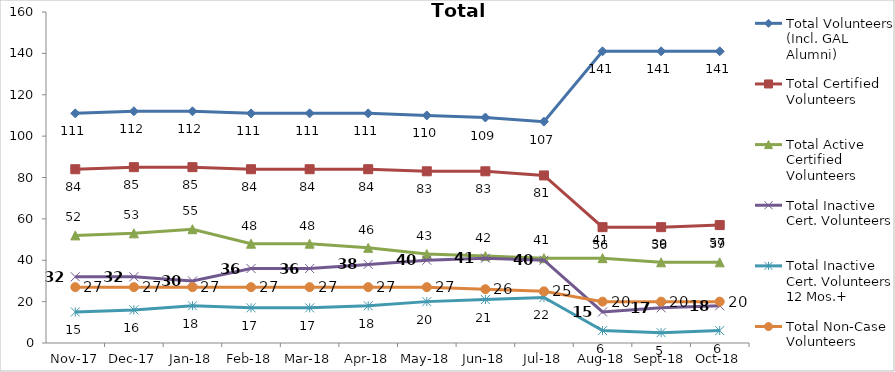
| Category | Total Volunteers (Incl. GAL Alumni) | Total Certified Volunteers | Total Active Certified Volunteers | Total Inactive Cert. Volunteers | Total Inactive Cert. Volunteers 12 Mos.+ | Total Non-Case Volunteers |
|---|---|---|---|---|---|---|
| 2017-11-01 | 111 | 84 | 52 | 32 | 15 | 27 |
| 2017-12-01 | 112 | 85 | 53 | 32 | 16 | 27 |
| 2018-01-01 | 112 | 85 | 55 | 30 | 18 | 27 |
| 2018-02-01 | 111 | 84 | 48 | 36 | 17 | 27 |
| 2018-03-01 | 111 | 84 | 48 | 36 | 17 | 27 |
| 2018-04-01 | 111 | 84 | 46 | 38 | 18 | 27 |
| 2018-05-01 | 110 | 83 | 43 | 40 | 20 | 27 |
| 2018-06-01 | 109 | 83 | 42 | 41 | 21 | 26 |
| 2018-07-01 | 107 | 81 | 41 | 40 | 22 | 25 |
| 2018-08-01 | 141 | 56 | 41 | 15 | 6 | 20 |
| 2018-09-01 | 141 | 56 | 39 | 17 | 5 | 20 |
| 2018-10-01 | 141 | 57 | 39 | 18 | 6 | 20 |